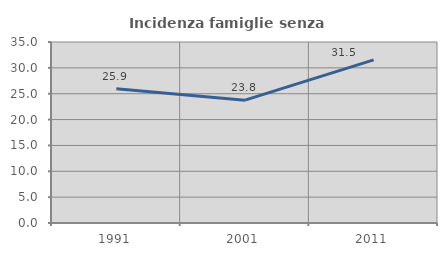
| Category | Incidenza famiglie senza nuclei |
|---|---|
| 1991.0 | 25.938 |
| 2001.0 | 23.757 |
| 2011.0 | 31.532 |